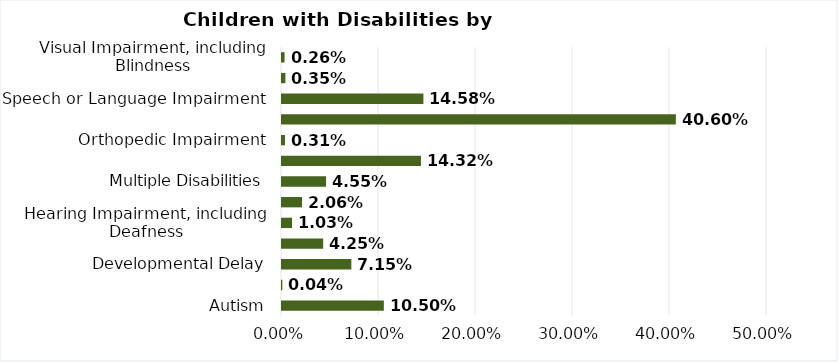
| Category | Series 0 |
|---|---|
| Autism | 0.105 |
| Deaf-Blindness | 0 |
| Developmental Delay | 0.071 |
| Serious Emotional Disability | 0.042 |
| Hearing Impairment, including Deafness | 0.01 |
| Intellectual Disability | 0.021 |
| Multiple Disabilities | 0.045 |
| Other Health Impairment  | 0.143 |
| Orthopedic Impairment | 0.003 |
| Specific Learning Disability | 0.406 |
| Speech or Language Impairment | 0.146 |
| Traumatic Brain Injury | 0.003 |
| Visual Impairment, including Blindness | 0.003 |